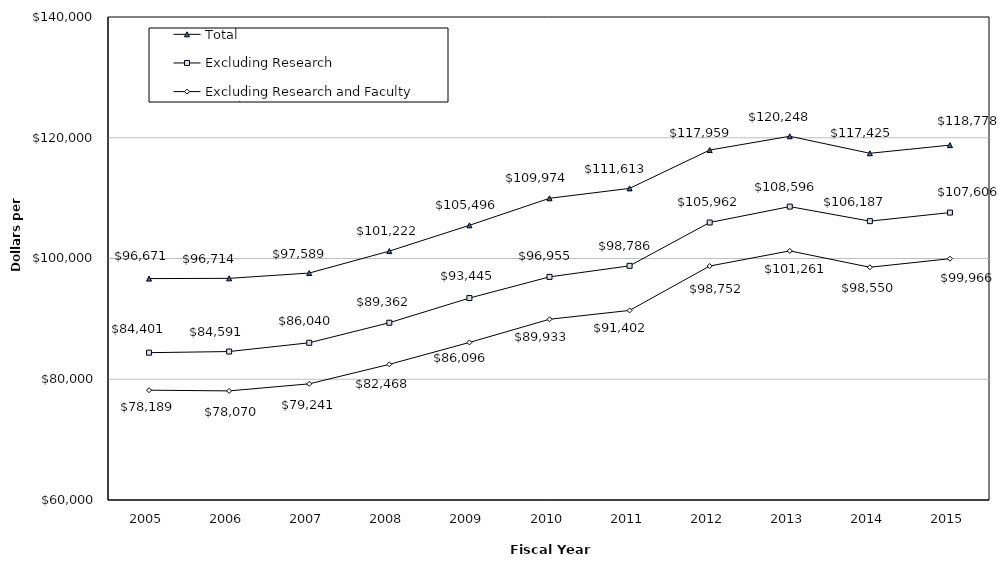
| Category | Total | Excluding Research | Excluding Research and Faculty Practice |
|---|---|---|---|
| 2005.0 | 96671 | 84401 | 78189 |
| 2006.0 | 96714 | 84591 | 78070 |
| 2007.0 | 97589 | 86040 | 79241 |
| 2008.0 | 101222 | 89362 | 82468 |
| 2009.0 | 105496 | 93445 | 86096 |
| 2010.0 | 109974 | 96955 | 89933 |
| 2011.0 | 111613 | 98786 | 91402 |
| 2012.0 | 117959 | 105962 | 98752 |
| 2013.0 | 120248 | 108596 | 101261 |
| 2014.0 | 117425 | 106187 | 98550 |
| 2015.0 | 118778 | 107606 | 99966 |